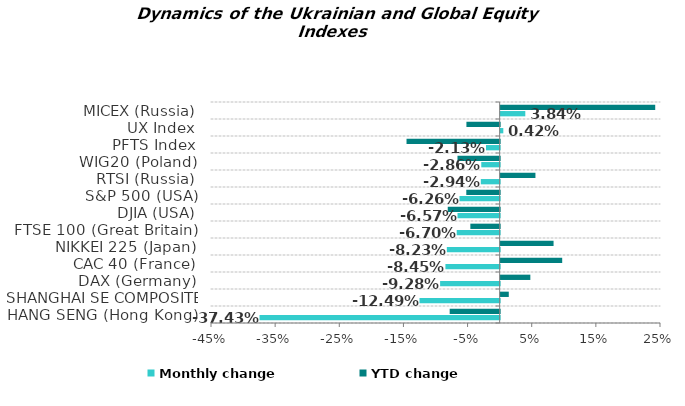
| Category | Monthly change | YTD change |
|---|---|---|
| HANG SENG (Hong Kong) | -0.374 | -0.078 |
| SHANGHAI SE COMPOSITE (China) | -0.125 | 0.013 |
| DAX (Germany) | -0.093 | 0.046 |
| CAC 40 (France) | -0.085 | 0.096 |
| NIKKEI 225 (Japan) | -0.082 | 0.083 |
| FTSE 100 (Great Britain) | -0.067 | -0.046 |
| DJIA (USA) | -0.066 | -0.081 |
| S&P 500 (USA) | -0.063 | -0.052 |
| RTSI (Russia) | -0.029 | 0.054 |
| WIG20 (Poland) | -0.029 | -0.066 |
| PFTS Index | -0.021 | -0.145 |
| UX Index | 0.004 | -0.052 |
| MICEX (Russia) | 0.038 | 0.241 |